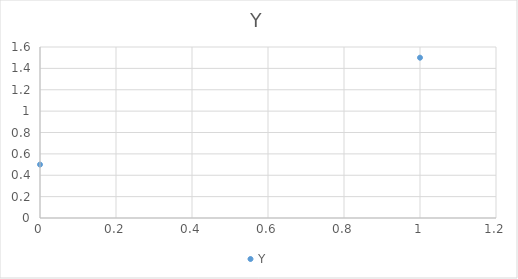
| Category | Y |
|---|---|
| 0.0 | 0.5 |
| 1.0 | 1.5 |